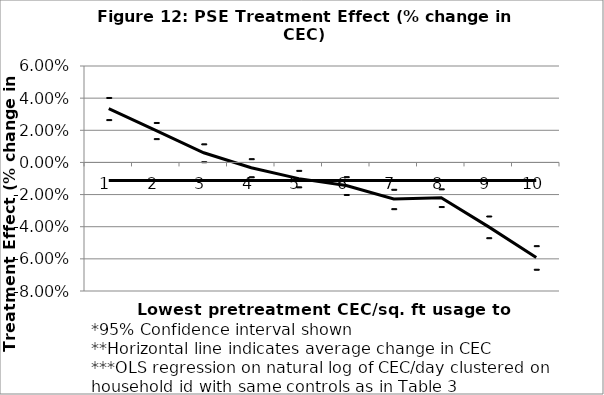
| Category | Coeff | 2 SD below | 2 SD above | Avg reduction |
|---|---|---|---|---|
| 0 | 0.034 | 0.027 | 0.04 | -0.011 |
| 1 | 0.02 | 0.015 | 0.025 | -0.011 |
| 2 | 0.006 | 0 | 0.012 | -0.011 |
| 3 | -0.003 | -0.009 | 0.002 | -0.011 |
| 4 | -0.01 | -0.015 | -0.005 | -0.011 |
| 5 | -0.014 | -0.02 | -0.009 | -0.011 |
| 6 | -0.023 | -0.029 | -0.017 | -0.011 |
| 7 | -0.022 | -0.027 | -0.016 | -0.011 |
| 8 | -0.04 | -0.047 | -0.033 | -0.011 |
| 9 | -0.059 | -0.066 | -0.052 | -0.011 |